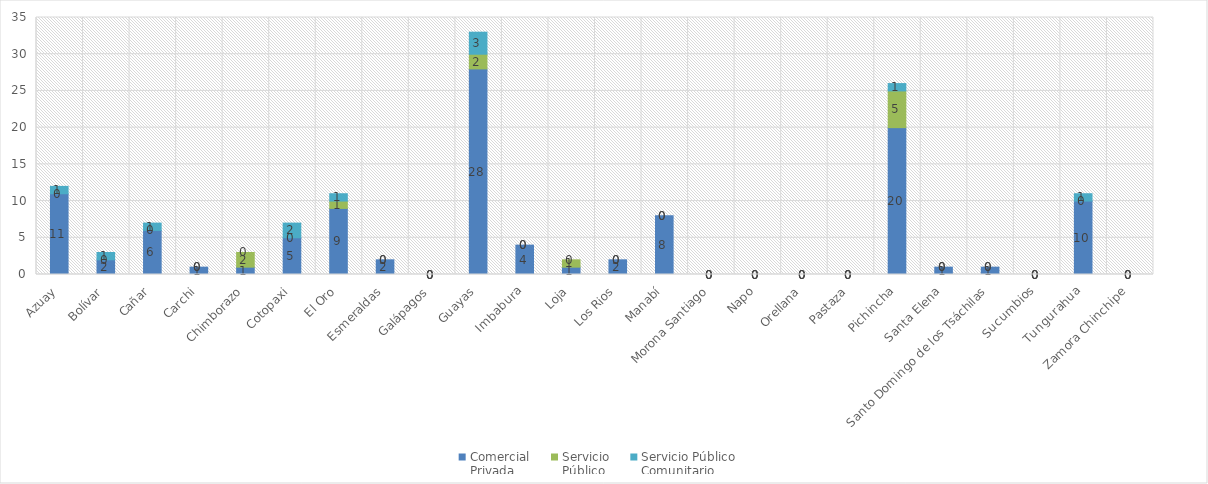
| Category | Comercial 
Privada | Servicio 
Público | Servicio Público
Comunitario |
|---|---|---|---|
| Azuay | 11 | 0 | 1 |
| Bolívar | 2 | 0 | 1 |
| Cañar | 6 | 0 | 1 |
| Carchi | 1 | 0 | 0 |
| Chimborazo | 1 | 2 | 0 |
| Cotopaxi | 5 | 0 | 2 |
| El Oro | 9 | 1 | 1 |
| Esmeraldas | 2 | 0 | 0 |
| Galápagos | 0 | 0 | 0 |
| Guayas | 28 | 2 | 3 |
| Imbabura | 4 | 0 | 0 |
| Loja | 1 | 1 | 0 |
| Los Rios | 2 | 0 | 0 |
| Manabí | 8 | 0 | 0 |
| Morona Santiago | 0 | 0 | 0 |
| Napo | 0 | 0 | 0 |
| Orellana | 0 | 0 | 0 |
| Pastaza | 0 | 0 | 0 |
| Pichincha | 20 | 5 | 1 |
| Santa Elena | 1 | 0 | 0 |
| Santo Domingo de los Tsáchilas | 1 | 0 | 0 |
| Sucumbios | 0 | 0 | 0 |
| Tungurahua | 10 | 0 | 1 |
| Zamora Chinchipe | 0 | 0 | 0 |